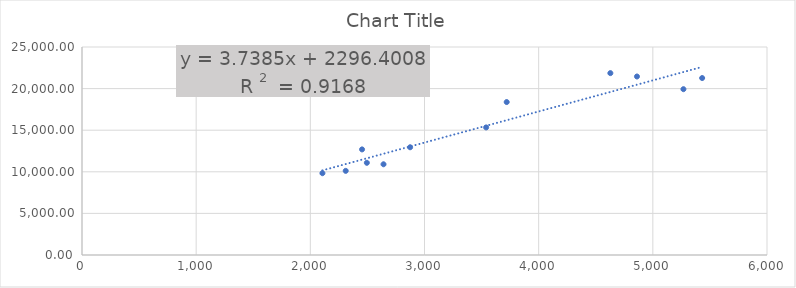
| Category | Series 0 |
|---|---|
| 2310.0 | 10113 |
| 2453.0 | 12691 |
| 2641.0 | 10905 |
| 2874.0 | 12949 |
| 3540.0 | 15334 |
| 4861.0 | 21455 |
| 5432.0 | 21270 |
| 5268.0 | 19930 |
| 4628.0 | 21860 |
| 3720.0 | 18383 |
| 2106.0 | 9830 |
| 2495.0 | 11081 |